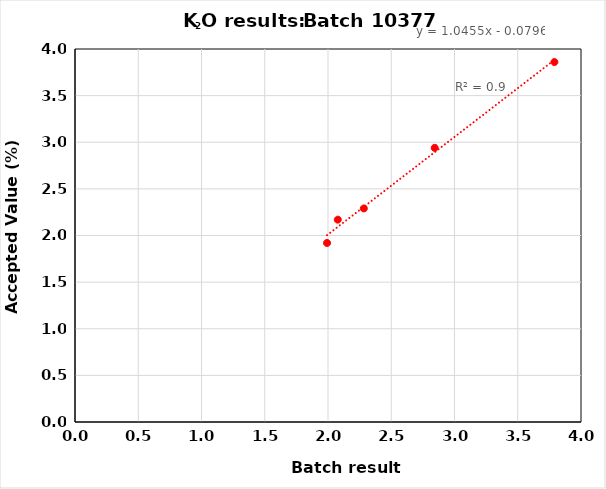
| Category | y |
|---|---|
| 2.0775 | 2.17 |
| 2.283333333333333 | 2.29 |
| 2.8433333333333333 | 2.94 |
| 3.79 | 3.86 |
| 1.9925 | 1.92 |